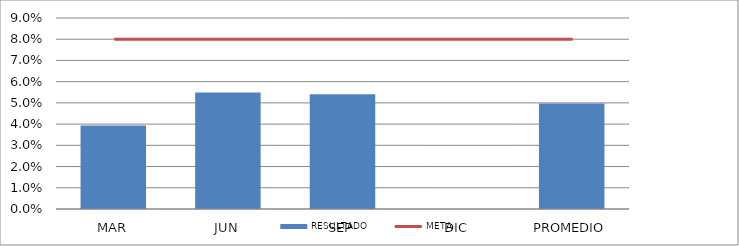
| Category | RESULTADO |
|---|---|
| MAR | 0.039 |
| JUN | 0.055 |
| SEP | 0.054 |
| DIC | 0 |
| PROMEDIO | 0.05 |